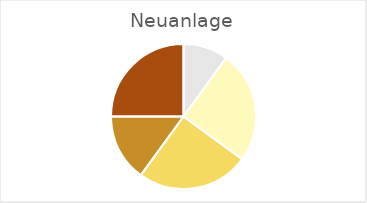
| Category | Series 0 |
|---|---|
| 0 | 0.1 |
| 1 | 0.25 |
| 2 | 0.25 |
| 3 | 0.15 |
| 4 | 0.25 |